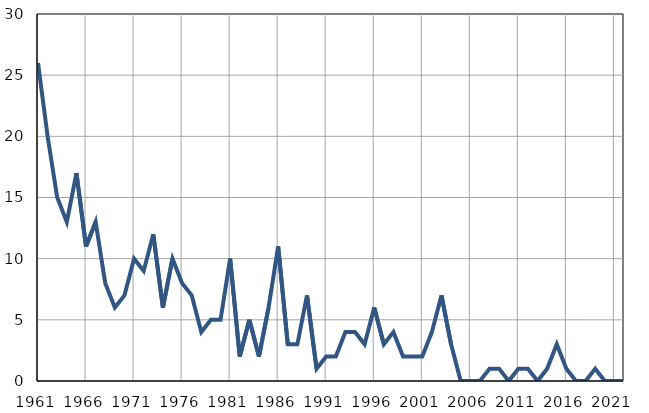
| Category | Infants
deaths |
|---|---|
| 1961.0 | 26 |
| 1962.0 | 20 |
| 1963.0 | 15 |
| 1964.0 | 13 |
| 1965.0 | 17 |
| 1966.0 | 11 |
| 1967.0 | 13 |
| 1968.0 | 8 |
| 1969.0 | 6 |
| 1970.0 | 7 |
| 1971.0 | 10 |
| 1972.0 | 9 |
| 1973.0 | 12 |
| 1974.0 | 6 |
| 1975.0 | 10 |
| 1976.0 | 8 |
| 1977.0 | 7 |
| 1978.0 | 4 |
| 1979.0 | 5 |
| 1980.0 | 5 |
| 1981.0 | 10 |
| 1982.0 | 2 |
| 1983.0 | 5 |
| 1984.0 | 2 |
| 1985.0 | 6 |
| 1986.0 | 11 |
| 1987.0 | 3 |
| 1988.0 | 3 |
| 1989.0 | 7 |
| 1990.0 | 1 |
| 1991.0 | 2 |
| 1992.0 | 2 |
| 1993.0 | 4 |
| 1994.0 | 4 |
| 1995.0 | 3 |
| 1996.0 | 6 |
| 1997.0 | 3 |
| 1998.0 | 4 |
| 1999.0 | 2 |
| 2000.0 | 2 |
| 2001.0 | 2 |
| 2002.0 | 4 |
| 2003.0 | 7 |
| 2004.0 | 3 |
| 2005.0 | 0 |
| 2006.0 | 0 |
| 2007.0 | 0 |
| 2008.0 | 1 |
| 2009.0 | 1 |
| 2010.0 | 0 |
| 2011.0 | 1 |
| 2012.0 | 1 |
| 2013.0 | 0 |
| 2014.0 | 1 |
| 2015.0 | 3 |
| 2016.0 | 1 |
| 2017.0 | 0 |
| 2018.0 | 0 |
| 2019.0 | 1 |
| 2020.0 | 0 |
| 2021.0 | 0 |
| 2022.0 | 0 |